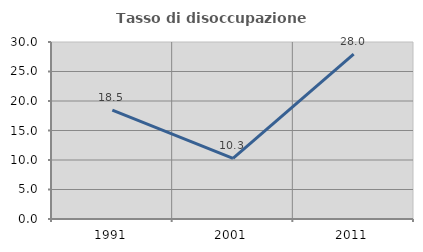
| Category | Tasso di disoccupazione giovanile  |
|---|---|
| 1991.0 | 18.45 |
| 2001.0 | 10.289 |
| 2011.0 | 27.953 |